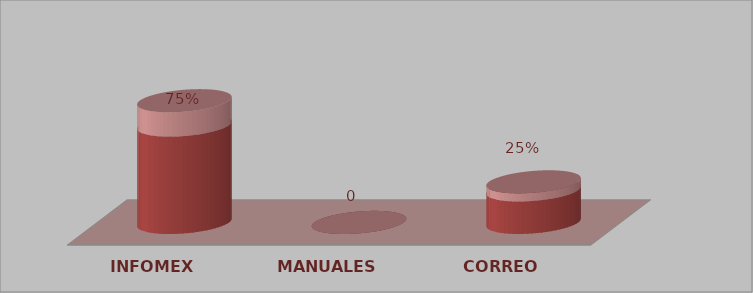
| Category | Series 0 | Series 1 |
|---|---|---|
| INFOMEX | 3 | 0.75 |
| MANUALES | 0 | 0 |
| CORREO | 1 | 0.25 |